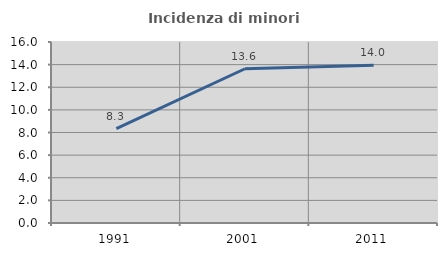
| Category | Incidenza di minori stranieri |
|---|---|
| 1991.0 | 8.333 |
| 2001.0 | 13.636 |
| 2011.0 | 13.953 |